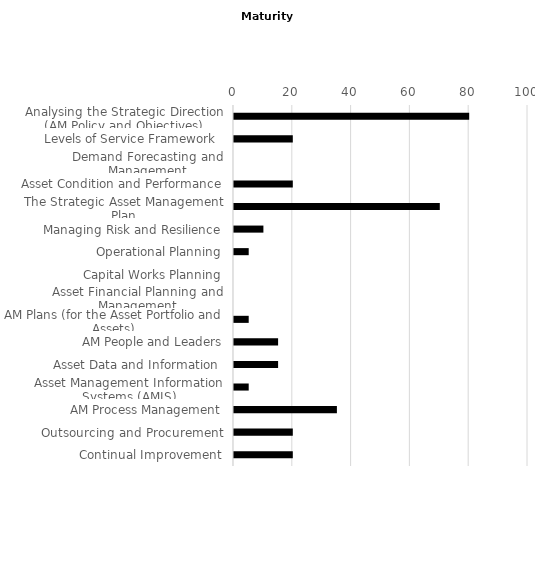
| Category | Maturity Gap |
|---|---|
| Analysing the Strategic Direction (AM Policy and Objectives)
 | 80 |
| Levels of Service Framework
 | 20 |
| Demand Forecasting and Management | 0 |
| Asset Condition and Performance | 20 |
| The Strategic Asset Management Plan
 | 70 |
| Managing Risk and Resilience | 10 |
| Operational Planning | 5 |
| Capital Works Planning | 0 |
| Asset Financial Planning and Management | 0 |
| AM Plans (for the Asset Portfolio and Assets) | 5 |
| AM People and Leaders | 15 |
| Asset Data and Information  | 15 |
| Asset Management Information Systems (AMIS) | 5 |
| AM Process Management | 35 |
| Outsourcing and Procurement | 20 |
| Continual Improvement | 20 |